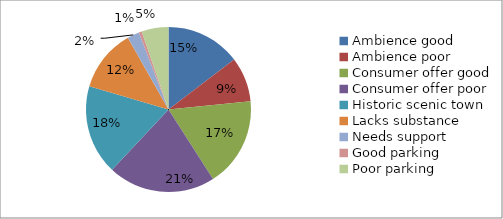
| Category | Series 3 | Series 2 | Series 1 | Series 0 |
|---|---|---|---|---|
| Ambience good | 25 |  |  |  |
| Ambience poor | 15 |  |  |  |
| Consumer offer good | 30 |  |  |  |
| Consumer offer poor | 36 |  |  |  |
| Historic scenic town | 30 |  |  |  |
| Lacks substance | 21 |  |  |  |
| Needs support | 4 |  |  |  |
| Good parking | 1 |  |  |  |
| Poor parking | 9 |  |  |  |